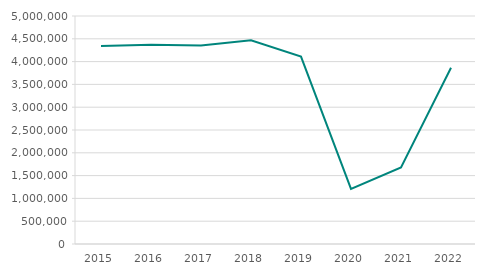
| Category | Totalt |
|---|---|
| 2015.0 | 4343429 |
| 2016.0 | 4370961 |
| 2017.0 | 4353389 |
| 2018.0 | 4466211 |
| 2019.0 | 4110100 |
| 2020.0 | 1208264 |
| 2021.0 | 1679811 |
| 2022.0 | 3865417 |